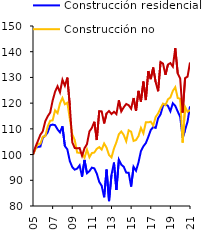
| Category | Construcción residencial | Construcción no residencial | Inversión en M&E |
|---|---|---|---|
| 2005-03-31 | 100 | 100 | 100 |
| 2005-06-30 | 102.475 | 102.125 | 102.989 |
| 2005-09-30 | 102.969 | 104.174 | 105.292 |
| 2005-12-31 | 103.113 | 104.162 | 107.699 |
| 2006-03-31 | 106.515 | 106.943 | 109.069 |
| 2006-06-30 | 107.371 | 107.147 | 112.962 |
| 2006-09-30 | 108.635 | 110.898 | 114.89 |
| 2006-12-31 | 111.39 | 113.16 | 116.325 |
| 2007-03-31 | 111.659 | 113.289 | 120.958 |
| 2007-06-30 | 111.438 | 117.209 | 124.445 |
| 2007-09-30 | 109.802 | 116.11 | 126.562 |
| 2007-12-31 | 108.617 | 119.923 | 124.214 |
| 2008-03-31 | 111.002 | 122.006 | 129.105 |
| 2008-06-30 | 103.277 | 119.569 | 126.775 |
| 2008-09-30 | 102.012 | 120.154 | 129.935 |
| 2008-12-31 | 97.499 | 113.963 | 119.18 |
| 2009-03-31 | 95.138 | 107.885 | 104.777 |
| 2009-06-30 | 94.125 | 105.681 | 102.562 |
| 2009-09-30 | 94.539 | 100.783 | 102.419 |
| 2009-12-31 | 95.8 | 100.691 | 102.549 |
| 2010-03-31 | 91.426 | 100.447 | 99.52 |
| 2010-06-30 | 97.926 | 98.771 | 102.458 |
| 2010-09-30 | 92.742 | 101.94 | 104.06 |
| 2010-12-31 | 93.549 | 98.95 | 108.985 |
| 2011-03-31 | 94.925 | 100.588 | 110.377 |
| 2011-06-30 | 94.632 | 100.801 | 112.761 |
| 2011-09-30 | 92.616 | 102.235 | 105.651 |
| 2011-12-31 | 89.372 | 102.896 | 116.905 |
| 2012-03-31 | 87.873 | 101.936 | 116.803 |
| 2012-06-30 | 83.406 | 104.301 | 112.105 |
| 2012-09-30 | 94.171 | 102.668 | 116.045 |
| 2012-12-31 | 81.903 | 99.796 | 116.917 |
| 2013-03-31 | 92.127 | 98.887 | 115.763 |
| 2013-06-30 | 96.883 | 102.334 | 116.636 |
| 2013-09-30 | 86.209 | 104.814 | 115.746 |
| 2013-12-31 | 98.016 | 107.896 | 121.079 |
| 2014-03-31 | 96.064 | 108.982 | 116.787 |
| 2014-06-30 | 95.239 | 107.584 | 118.401 |
| 2014-09-30 | 92.983 | 105.163 | 119.663 |
| 2014-12-31 | 92.921 | 109.432 | 119.206 |
| 2015-03-31 | 87.56 | 108.895 | 117.829 |
| 2015-06-30 | 95.239 | 105.308 | 122.002 |
| 2015-09-30 | 93.716 | 105.657 | 116.995 |
| 2015-12-31 | 96.94 | 107.215 | 124.778 |
| 2016-03-31 | 101.353 | 110.348 | 120.601 |
| 2016-06-30 | 103.195 | 108.252 | 128.4 |
| 2016-09-30 | 104.474 | 112.544 | 121.197 |
| 2016-12-31 | 106.865 | 112.537 | 132.479 |
| 2017-03-31 | 109.537 | 112.805 | 129.328 |
| 2017-06-30 | 110.708 | 111.301 | 133.848 |
| 2017-09-30 | 110.373 | 114.624 | 128.175 |
| 2017-12-31 | 114.101 | 116 | 124.64 |
| 2018-03-31 | 115.644 | 118.044 | 136.017 |
| 2018-06-30 | 118.996 | 119.81 | 135.375 |
| 2018-09-30 | 119.569 | 119.216 | 131.011 |
| 2018-12-31 | 118.943 | 121.49 | 134.996 |
| 2019-03-31 | 116.843 | 122.204 | 135.572 |
| 2019-06-30 | 119.958 | 124.757 | 134.213 |
| 2019-09-30 | 118.937 | 126.201 | 141.414 |
| 2019-12-31 | 116.74 | 121.977 | 131.503 |
| 2020-03-31 | 114.664 | 121.721 | 129.577 |
| 2020-06-30 | 106.502 | 104.651 | 116.326 |
| 2020-09-30 | 109.579 | 118.506 | 129.716 |
| 2020-12-31 | 112.796 | 116.585 | 130.281 |
| 2021-03-31 | 118.779 | 117.3 | 135.803 |